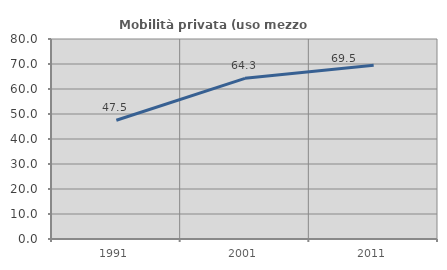
| Category | Mobilità privata (uso mezzo privato) |
|---|---|
| 1991.0 | 47.487 |
| 2001.0 | 64.26 |
| 2011.0 | 69.488 |